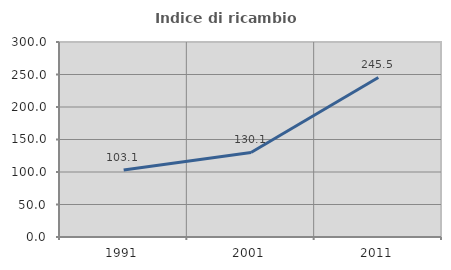
| Category | Indice di ricambio occupazionale  |
|---|---|
| 1991.0 | 103.064 |
| 2001.0 | 130.094 |
| 2011.0 | 245.465 |